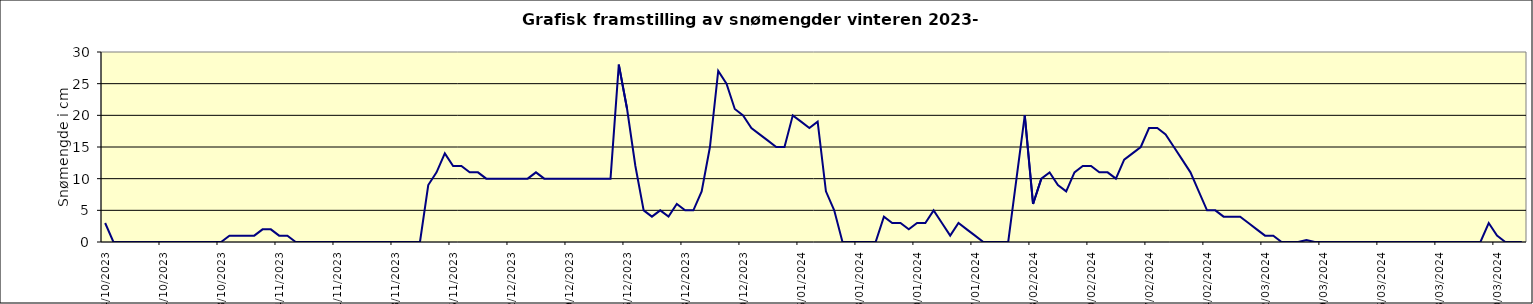
| Category | Series 0 |
|---|---|
| 14/10/2023 | 3 |
| 15/10/2023 | 0 |
| 16/10/2023 | 0 |
| 17/10/2023 | 0 |
| 18/10/2023 | 0 |
| 19/10/2023 | 0 |
| 20/10/2023 | 0 |
| 21/10/2023 | 0 |
| 22/10/2023 | 0 |
| 23/10/2023 | 0 |
| 24/10/2023 | 0 |
| 25/10/2023 | 0 |
| 26/10/2023 | 0 |
| 27/10/2023 | 0 |
| 28/10/2023 | 0 |
| 29/10/2023 | 1 |
| 30/10/2023 | 1 |
| 31/10/2023 | 1 |
| 01/11/2023 | 1 |
| 02/11/2023 | 2 |
| 03/11/2023 | 2 |
| 04/11/2023 | 1 |
| 05/11/2023 | 1 |
| 06/11/2023 | 0 |
| 07/11/2023 | 0 |
| 08/11/2023 | 0 |
| 09/11/2023 | 0 |
| 10/11/2023 | 0 |
| 11/11/2023 | 0 |
| 12/11/2023 | 0 |
| 13/11/2023 | 0 |
| 14/11/2023 | 0 |
| 15/11/2023 | 0 |
| 16/11/2023 | 0 |
| 17/11/2023 | 0 |
| 18/11/2023 | 0 |
| 19/11/2023 | 0 |
| 20/11/2023 | 0 |
| 21/11/2023 | 0 |
| 22/11/2023 | 9 |
| 23/11/2023 | 11 |
| 24/11/2023 | 14 |
| 25/11/2023 | 12 |
| 26/11/2023 | 12 |
| 27/11/2023 | 11 |
| 28/11/2023 | 11 |
| 29/11/2023 | 10 |
| 30/11/2023 | 10 |
| 01/12/2023 | 10 |
| 02/12/2023 | 10 |
| 03/12/2023 | 10 |
| 04/12/2023 | 10 |
| 05/12/2023 | 11 |
| 06/12/2023 | 10 |
| 07/12/2023 | 10 |
| 08/12/2023 | 10 |
| 09/12/2023 | 10 |
| 10/12/2023 | 10 |
| 11/12/2023 | 10 |
| 12/12/2023 | 10 |
| 13/12/2023 | 10 |
| 14/12/2023 | 10 |
| 15/12/2023 | 28 |
| 16/12/2023 | 21 |
| 17/12/2023 | 12 |
| 18/12/2023 | 5 |
| 19/12/2023 | 4 |
| 20/12/2023 | 5 |
| 21/12/2023 | 4 |
| 22/12/2023 | 6 |
| 23/12/2023 | 5 |
| 24/12/2023 | 5 |
| 25/12/2023 | 8 |
| 26/12/2023 | 15 |
| 27/12/2023 | 27 |
| 28/12/2023 | 25 |
| 29/12/2023 | 21 |
| 30/12/2023 | 20 |
| 31/12/2023 | 18 |
| 01/01/2024 | 17 |
| 02/01/2024 | 16 |
| 03/01/2024 | 15 |
| 04/01/2024 | 15 |
| 05/01/2024 | 20 |
| 06/01/2024 | 19 |
| 07/01/2024 | 18 |
| 08/01/2024 | 19 |
| 09/01/2024 | 8 |
| 10/01/2024 | 5 |
| 11/01/2024 | 0 |
| 12/01/2024 | 0 |
| 13/01/2024 | 0 |
| 14/01/2024 | 0 |
| 15/01/2024 | 0 |
| 16/01/2024 | 4 |
| 17/01/2024 | 3 |
| 18/01/2024 | 3 |
| 19/01/2024 | 2 |
| 20/01/2024 | 3 |
| 21/01/2024 | 3 |
| 22/01/2024 | 5 |
| 23/01/2024 | 3 |
| 24/01/2024 | 1 |
| 25/01/2024 | 3 |
| 26/01/2024 | 2 |
| 27/01/2024 | 1 |
| 28/01/2024 | 0 |
| 29/01/2024 | 0 |
| 30/01/2024 | 0 |
| 31/01/2024 | 0 |
| 01/02/2024 | 10 |
| 02/02/2024 | 20 |
| 03/02/2024 | 6 |
| 04/02/2024 | 10 |
| 05/02/2024 | 11 |
| 06/02/2024 | 9 |
| 07/02/2024 | 8 |
| 08/02/2024 | 11 |
| 09/02/2024 | 12 |
| 10/02/2024 | 12 |
| 11/02/2024 | 11 |
| 12/02/2024 | 11 |
| 13/02/2024 | 10 |
| 14/02/2024 | 13 |
| 15/02/2024 | 14 |
| 16/02/2024 | 15 |
| 17/02/2024 | 18 |
| 18/02/2024 | 18 |
| 19/02/2024 | 17 |
| 20/02/2024 | 15 |
| 21/02/2024 | 13 |
| 22/02/2024 | 11 |
| 23/02/2024 | 8 |
| 24/02/2024 | 5 |
| 25/02/2024 | 5 |
| 26/02/2024 | 4 |
| 27/02/2024 | 4 |
| 28/02/2024 | 4 |
| 29/02/2024 | 3 |
| 01/03/2024 | 2 |
| 02/03/2024 | 1 |
| 03/03/2024 | 1 |
| 04/03/2024 | 0 |
| 05/03/2024 | 0 |
| 06/03/2024 | 0 |
| 07/03/2024 | 0.3 |
| 08/03/2024 | 0 |
| 09/03/2024 | 0 |
| 10/03/2024 | 0 |
| 11/03/2024 | 0 |
| 12/03/2024 | 0 |
| 13/03/2024 | 0 |
| 14/03/2024 | 0 |
| 15/03/2024 | 0 |
| 16/03/2024 | 0 |
| 17/03/2024 | 0 |
| 18/03/2024 | 0 |
| 19/03/2024 | 0 |
| 20/03/2024 | 0 |
| 21/03/2024 | 0 |
| 22/03/2024 | 0 |
| 23/03/2024 | 0 |
| 24/03/2024 | 0 |
| 25/03/2024 | 0 |
| 26/03/2024 | 0 |
| 27/03/2024 | 0 |
| 28/03/2024 | 0 |
| 29/03/2024 | 3 |
| 30/03/2024 | 1 |
| 31/03/2024 | 0 |
| 01/04/2024 | 0 |
| 02/04/2024 | 0 |